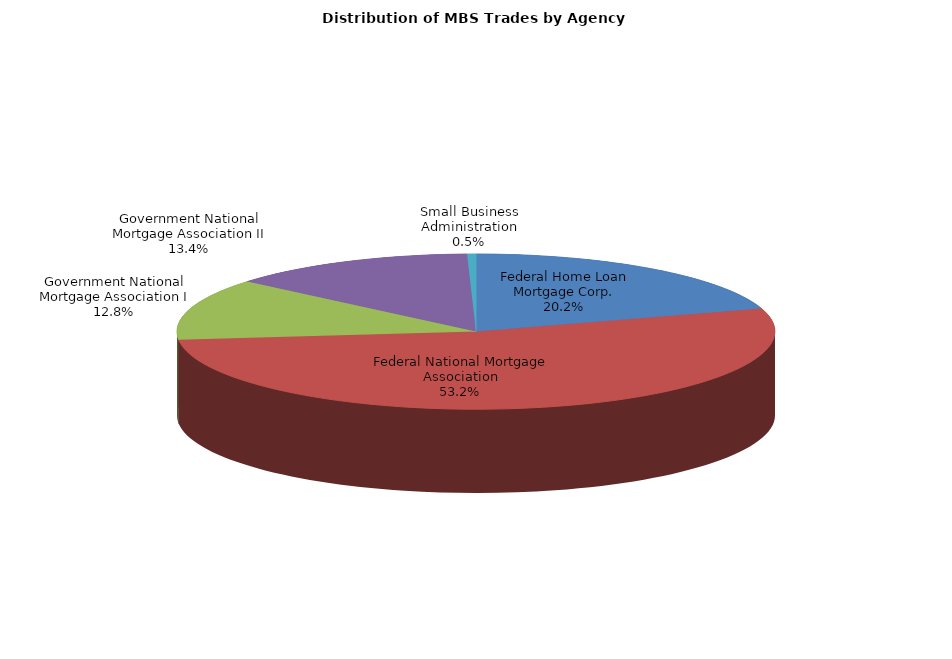
| Category | Series 0 |
|---|---|
| Federal Home Loan Mortgage Corp. | 744.778 |
| Federal National Mortgage Association | 1963.004 |
| Government National Mortgage Association I | 473.639 |
| Government National Mortgage Association II | 493.587 |
| Small Business Administration | 17.667 |